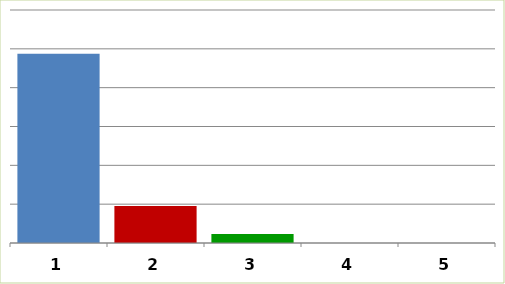
| Category | Series 0 |
|---|---|
| 0 | 24366902.2 |
| 1 | 4769997 |
| 2 | 1158798.96 |
| 3 | 0 |
| 4 | 0 |